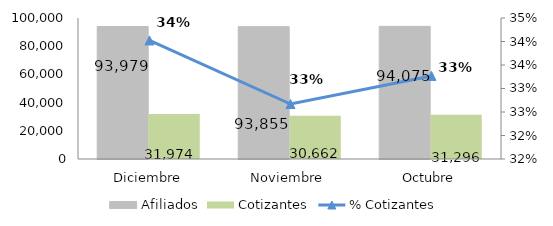
| Category | Afiliados | Cotizantes |
|---|---|---|
| Diciembre | 93979 | 31974 |
| Noviembre | 93855 | 30662 |
| Octubre | 94075 | 31296 |